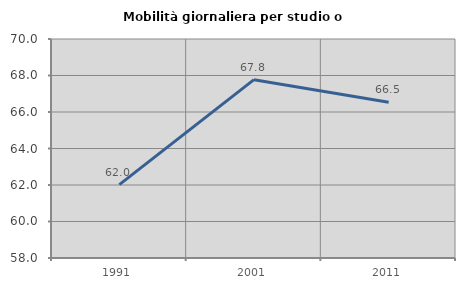
| Category | Mobilità giornaliera per studio o lavoro |
|---|---|
| 1991.0 | 62.021 |
| 2001.0 | 67.771 |
| 2011.0 | 66.534 |